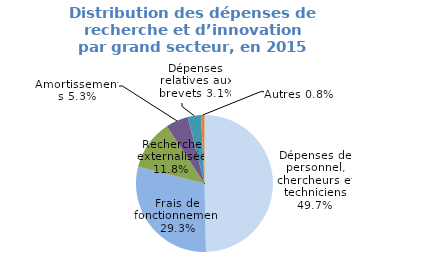
| Category | Series 0 |
|---|---|
| Dépenses de personnel, chercheurs et techniciens | 0.497 |
| Frais de fonctionnement | 0.293 |
| Recherche externalisée | 0.118 |
| Amortissements | 0.053 |
| Dépenses relatives aux brevets | 0.031 |
| Autres | 0.008 |